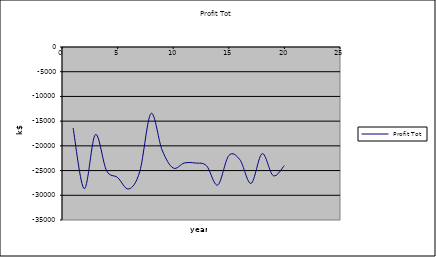
| Category | Profit Tot |
|---|---|
| 1.0 | -16403.578 |
| 2.0 | -28673.003 |
| 3.0 | -17714.209 |
| 4.0 | -24970.765 |
| 5.0 | -26410.964 |
| 6.0 | -28727.698 |
| 7.0 | -25139.871 |
| 8.0 | -13460.386 |
| 9.0 | -20839.305 |
| 10.0 | -24484.233 |
| 11.0 | -23466.62 |
| 12.0 | -23474.36 |
| 13.0 | -24036.531 |
| 14.0 | -27933.046 |
| 15.0 | -21957.898 |
| 16.0 | -22813.163 |
| 17.0 | -27596.566 |
| 18.0 | -21579.407 |
| 19.0 | -26037.31 |
| 20.0 | -23971.687 |